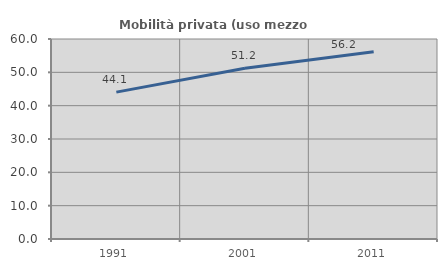
| Category | Mobilità privata (uso mezzo privato) |
|---|---|
| 1991.0 | 44.069 |
| 2001.0 | 51.235 |
| 2011.0 | 56.202 |